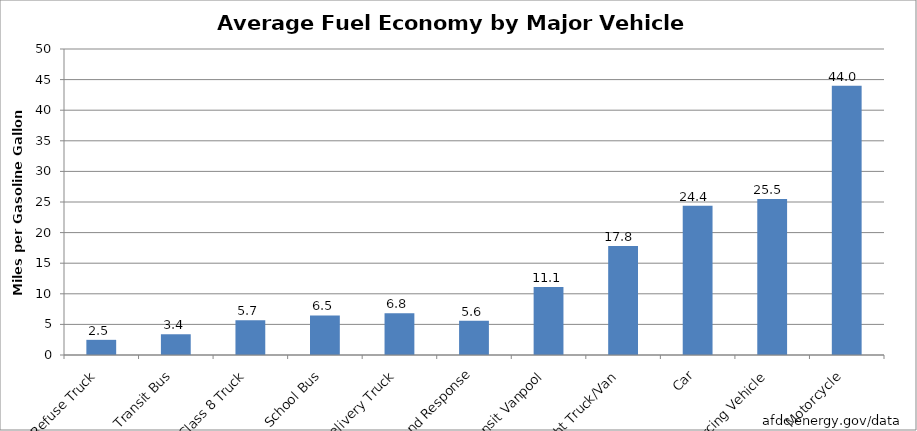
| Category | mpg Gasoline |
|---|---|
| Refuse Truck | 2.478 |
| Transit Bus | 3.39 |
| Class 8 Truck | 5.664 |
| School Bus | 6.46 |
| Delivery Truck | 6.815 |
| Demand Response | 5.584 |
| Transit Vanpool | 11.116 |
| Light Truck/Van | 17.8 |
| Car | 24.4 |
| Ridesourcing Vehicle | 25.5 |
| Motorcycle | 44 |